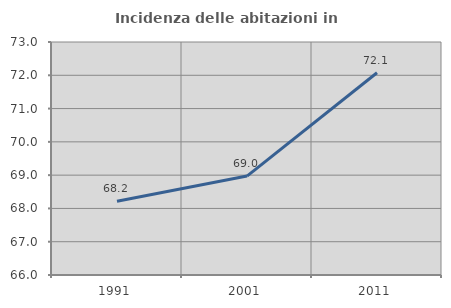
| Category | Incidenza delle abitazioni in proprietà  |
|---|---|
| 1991.0 | 68.217 |
| 2001.0 | 68.972 |
| 2011.0 | 72.078 |